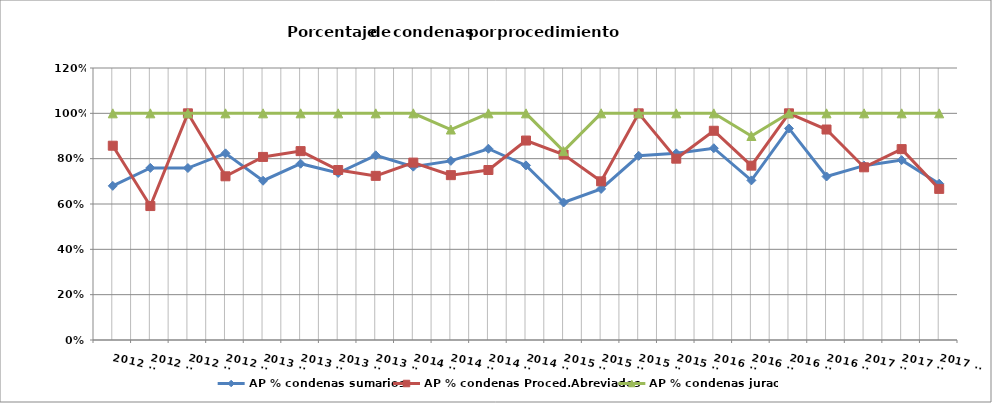
| Category | AP % condenas sumarios | AP % condenas Proced.Abreviados | AP % condenas jurado |
|---|---|---|---|
| 2012 T1 | 0.68 | 0.857 | 1 |
| 2012 T2 | 0.759 | 0.591 | 1 |
| 2012 T3 | 0.759 | 1 | 1 |
| 2012 T4 | 0.824 | 0.722 | 1 |
| 2013 T1 | 0.703 | 0.808 | 1 |
| 2013 T2 | 0.778 | 0.833 | 1 |
| 2013 T3 | 0.737 | 0.75 | 1 |
| 2013 T4 | 0.815 | 0.724 | 1 |
| 2014 T1 | 0.765 | 0.783 | 1 |
| 2014 T2 | 0.79 | 0.727 | 0.929 |
| 2014 T3 | 0.844 | 0.75 | 1 |
| 2014 T4 | 0.77 | 0.88 | 1 |
| 2015 T1 | 0.607 | 0.818 | 0.833 |
| 2015 T2 | 0.667 | 0.7 | 1 |
| 2015 T3 | 0.812 | 1 | 1 |
| 2015 T4 | 0.824 | 0.8 | 1 |
| 2016 T1 | 0.846 | 0.923 | 1 |
| 2016 T2 | 0.704 | 0.769 | 0.9 |
| 2016 T3 | 0.933 | 1 | 1 |
| 2016 T4 | 0.721 | 0.929 | 1 |
| 2017 T1 | 0.769 | 0.762 | 1 |
| 2017 T2 | 0.794 | 0.842 | 1 |
| 2017 T3 | 0.69 | 0.667 | 1 |